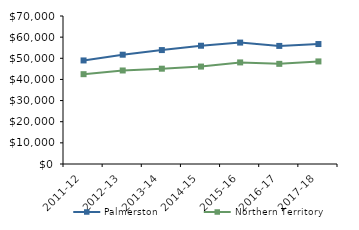
| Category | Palmerston | Northern Territory |
|---|---|---|
| 2011-12 | 48981.47 | 42481 |
| 2012-13 | 51694.55 | 44232.02 |
| 2013-14 | 53880.53 | 45075.51 |
| 2014-15 | 55936 | 46083.65 |
| 2015-16 | 57425.2 | 48046.27 |
| 2016-17 | 55851.02 | 47367.05 |
| 2017-18 | 56741.34 | 48519 |